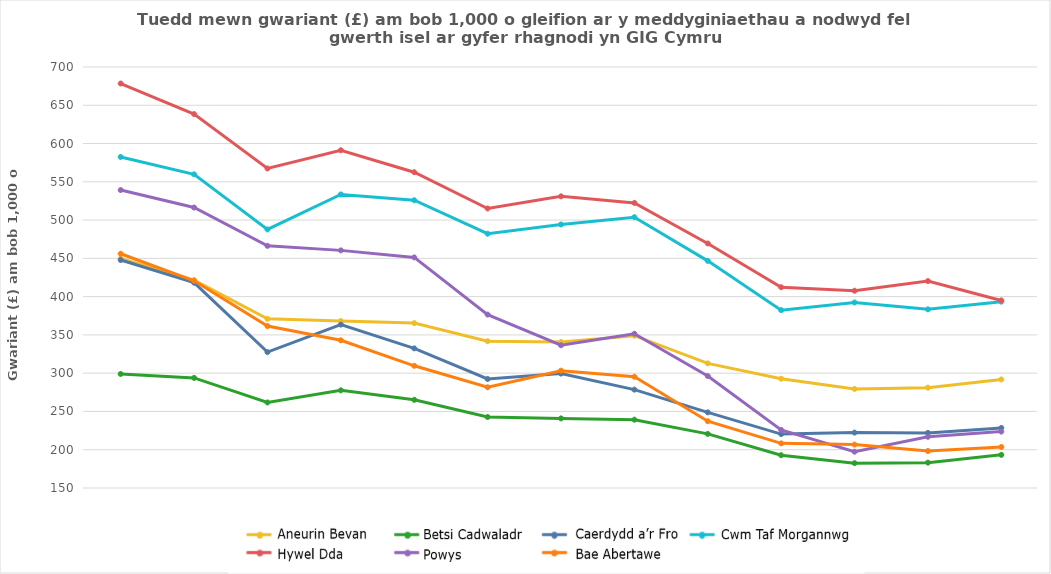
| Category | Aneurin Bevan | Betsi Cadwaladr | Cardiff And Vale | Cwm Taf Morgannwg | Hywel Dda | Powys | Swansea Bay |
|---|---|---|---|---|---|---|---|
| Dec 2017 | 449.801 | 298.971 | 447.833 | 582.499 | 678.428 | 539.248 | 456.036 |
| Mar 2018 | 421.665 | 293.836 | 418.219 | 559.791 | 638.494 | 516.412 | 420.749 |
| Jun 2018 | 370.986 | 261.739 | 327.515 | 487.781 | 567.411 | 466.373 | 361.53 |
| Sep 2018 | 368.103 | 277.577 | 363.456 | 533.528 | 591.239 | 460.438 | 342.926 |
| Dec 2018 | 365.43 | 265.214 | 332.425 | 525.922 | 562.524 | 451.262 | 309.635 |
| Mar 2019 | 341.696 | 242.755 | 292.418 | 482.21 | 515.175 | 376.566 | 281.58 |
| Jun 2019 | 340.766 | 240.909 | 299.502 | 494.266 | 531.026 | 336.503 | 303.292 |
| Sep 2019 | 349.019 | 239.259 | 278.547 | 503.787 | 522.432 | 351.538 | 295.347 |
| Dec 2019 | 312.817 | 220.69 | 248.831 | 446.715 | 469.464 | 296.281 | 237.236 |
| Mar 2020 | 292.762 | 192.84 | 220.453 | 382.346 | 412.304 | 225.842 | 208.312 |
| Jun 2020 | 279.406 | 182.452 | 222.399 | 392.351 | 407.709 | 197.423 | 206.724 |
| Sep 2020 | 281.06 | 183.141 | 222.005 | 383.388 | 420.347 | 216.867 | 198.317 |
| Dec 2020 | 291.789 | 193.305 | 228.488 | 393.447 | 395.051 | 223.675 | 203.561 |